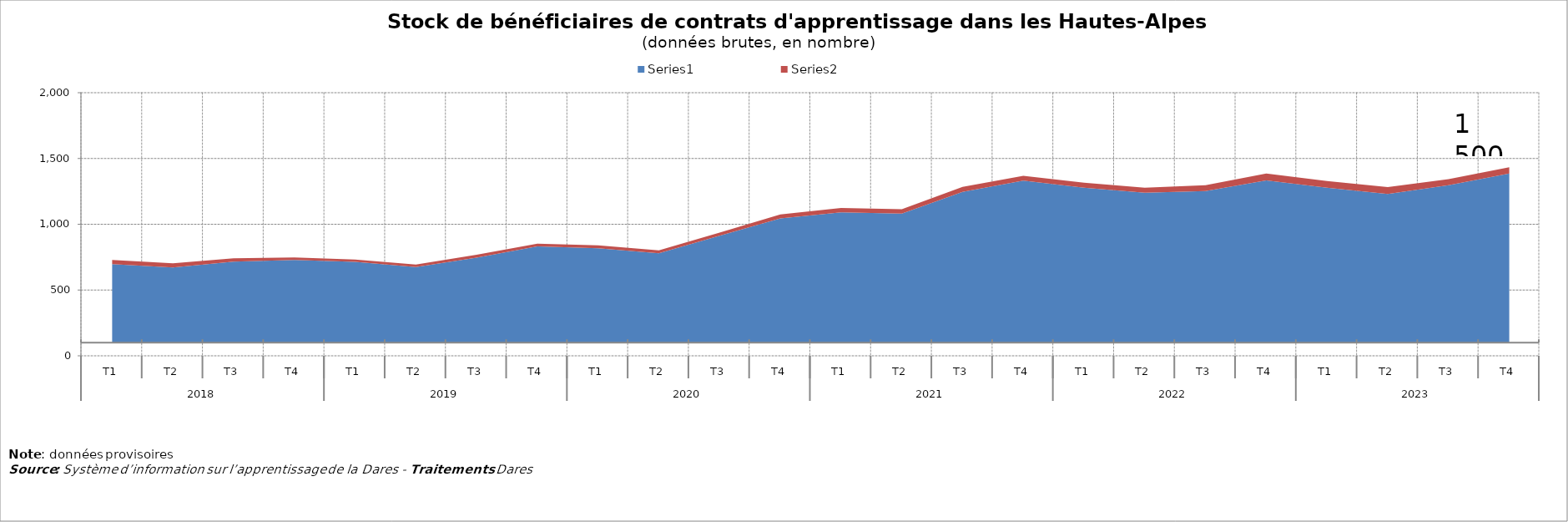
| Category | Series 0 | Series 1 |
|---|---|---|
| 0 | 697 | 31 |
| 1 | 671 | 32 |
| 2 | 716 | 26 |
| 3 | 729 | 18 |
| 4 | 714 | 18 |
| 5 | 675 | 18 |
| 6 | 746 | 23 |
| 7 | 831 | 22 |
| 8 | 818 | 22 |
| 9 | 779 | 22 |
| 10 | 913 | 23 |
| 11 | 1044 | 31 |
| 12 | 1091 | 33 |
| 13 | 1081 | 33 |
| 14 | 1246 | 38 |
| 15 | 1332 | 37 |
| 16 | 1277 | 39 |
| 17 | 1239 | 38 |
| 18 | 1253 | 44 |
| 19 | 1334 | 51 |
| 20 | 1278 | 51 |
| 21 | 1230 | 53 |
| 22 | 1297 | 46 |
| 23 | 1386 | 48 |